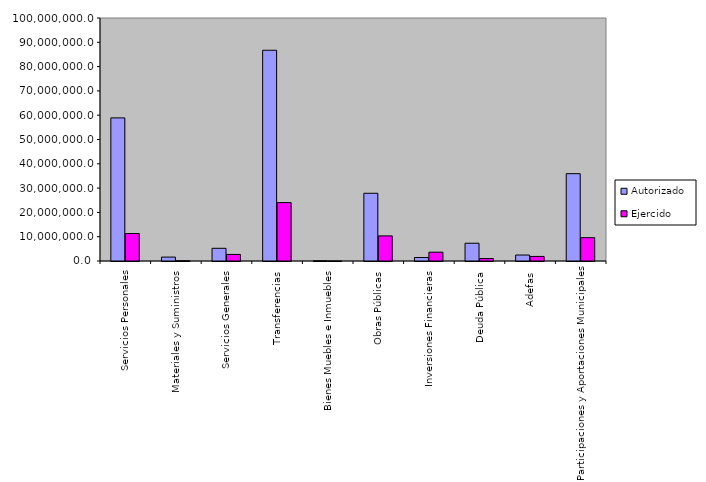
| Category | Autorizado | Ejercido |
|---|---|---|
| 0 | 58895890.9 | 11297606.7 |
| 1 | 1609010 | 103014.4 |
| 2 | 5222315 | 2706135.6 |
| 3 | 86727216.8 | 24039095.4 |
| 4 | 101494.4 | 147.4 |
| 5 | 27868073.5 | 10331064.5 |
| 6 | 1434450.6 | 3623391.2 |
| 7 | 7312000 | 993474 |
| 8 | 2460700 | 1878800.4 |
| 9 | 35942109.8 | 9595827.4 |